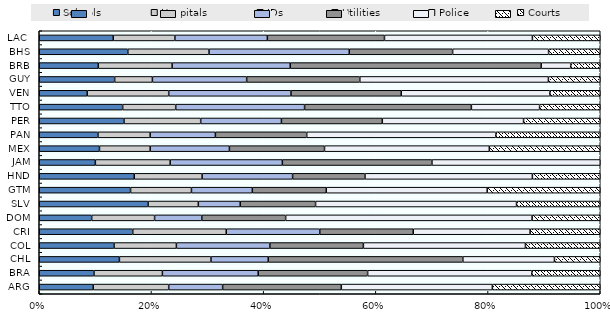
| Category | Schools | Hospitals | IDs | Utilities | Police | Courts |
|---|---|---|---|---|---|---|
| ARG | 0.05 | 0.07 | 0.05 | 0.11 | 0.14 | 0.1 |
| BRA | 0.04 | 0.05 | 0.07 | 0.08 | 0.12 | 0.05 |
| CHL | 0.07 | 0.08 | 0.05 | 0.17 | 0.08 | 0.04 |
| COL | 0.12 | 0.1 | 0.15 | 0.15 | 0.26 | 0.12 |
| CRI | 0.04 | 0.04 | 0.04 | 0.04 | 0.05 | 0.03 |
| DOM | 0.1 | 0.12 | 0.09 | 0.16 | 0.47 | 0.13 |
| SLV | 0.13 | 0.06 | 0.05 | 0.09 | 0.24 | 0.1 |
| GTM | 0.21 | 0.14 | 0.14 | 0.17 | 0.37 | 0.26 |
| HND | 0.21 | 0.15 | 0.2 | 0.16 | 0.37 | 0.15 |
| JAM | 0.06 | 0.08 | 0.12 | 0.16 | 0.18 | 0 |
| MEX | 0.19 | 0.16 | 0.25 | 0.3 | 0.52 | 0.35 |
| PAN | 0.09 | 0.08 | 0.1 | 0.14 | 0.29 | 0.16 |
| PER | 0.21 | 0.19 | 0.2 | 0.25 | 0.35 | 0.19 |
| TTO | 0.11 | 0.07 | 0.17 | 0.22 | 0.09 | 0.08 |
| VEN | 0.2 | 0.34 | 0.51 | 0.46 | 0.62 | 0.21 |
| GUY | 0.16 | 0.08 | 0.2 | 0.24 | 0.4 | 0.11 |
| BRB | 0.04 | 0.05 | 0.08 | 0.17 | 0.02 | 0.02 |
| BHS | 0.12 | 0.11 | 0.19 | 0.14 | 0.13 | 0.07 |
| LAC  | 0.12 | 0.1 | 0.15 | 0.19 | 0.24 | 0.11 |